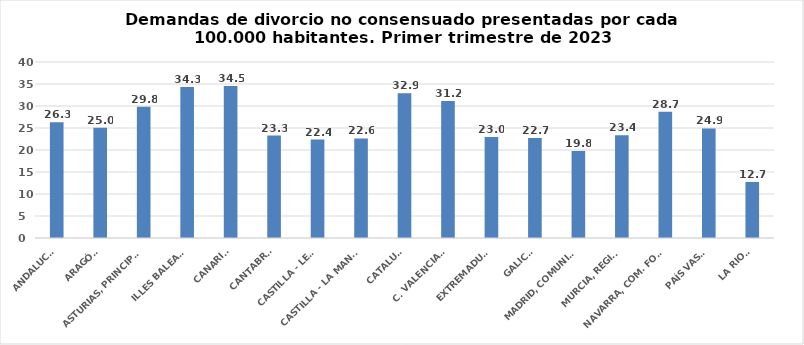
| Category | Series 0 |
|---|---|
| ANDALUCÍA | 26.312 |
| ARAGÓN | 25.05 |
| ASTURIAS, PRINCIPADO | 29.803 |
| ILLES BALEARS | 34.308 |
| CANARIAS | 34.525 |
| CANTABRIA | 23.278 |
| CASTILLA - LEÓN | 22.371 |
| CASTILLA - LA MANCHA | 22.637 |
| CATALUÑA | 32.877 |
| C. VALENCIANA | 31.16 |
| EXTREMADURA | 22.954 |
| GALICIA | 22.706 |
| MADRID, COMUNIDAD | 19.755 |
| MURCIA, REGIÓN | 23.379 |
| NAVARRA, COM. FORAL | 28.712 |
| PAÍS VASCO | 24.911 |
| LA RIOJA | 12.723 |